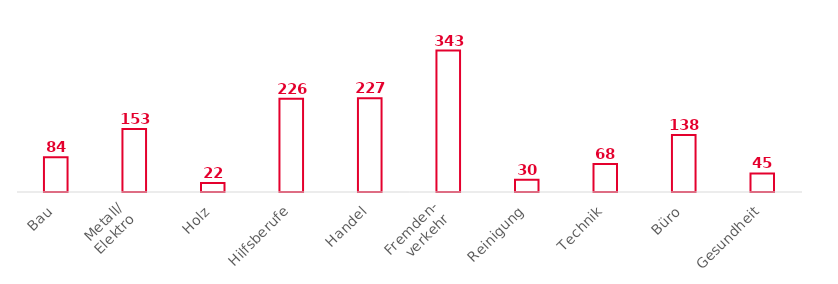
| Category | Series 0 |
|---|---|
| Bau | 84 |
| Metall/
Elektro | 153 |
| Holz | 22 |
| Hilfsberufe | 226 |
| Handel | 227 |
| Fremden-
verkehr | 343 |
| Reinigung | 30 |
| Technik | 68 |
| Büro | 138 |
| Gesundheit | 45 |